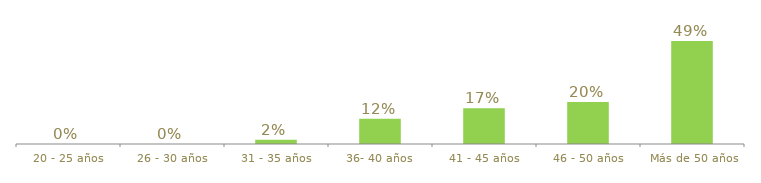
| Category | Series 0 |
|---|---|
| 20 - 25 años | 0 |
| 26 - 30 años | 0 |
| 31 - 35 años | 0.02 |
| 36- 40 años | 0.12 |
| 41 - 45 años | 0.17 |
| 46 - 50 años | 0.2 |
|  Más de 50 años | 0.49 |